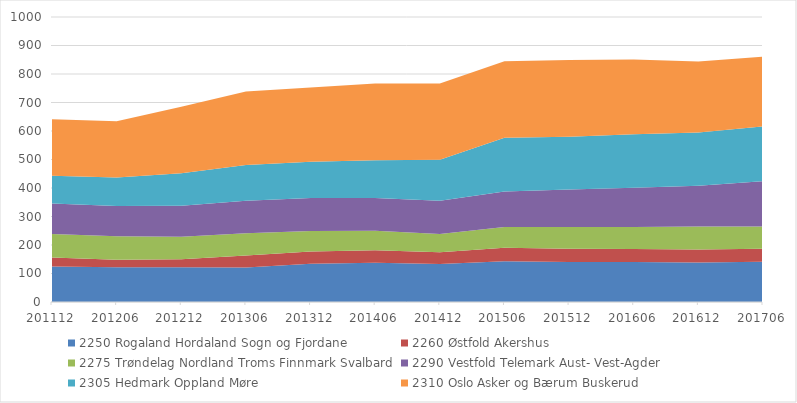
| Category | 2250 Rogaland Hordaland Sogn og Fjordane | 2260 Østfold Akershus | 2275 Trøndelag Nordland Troms Finnmark Svalbard | 2290 Vestfold Telemark Aust- Vest-Agder | 2305 Hedmark Oppland Møre | 2310 Oslo Asker og Bærum Buskerud |
|---|---|---|---|---|---|---|
| 201112.0 | 125 | 31 | 83 | 107 | 97 | 198 |
| 201206.0 | 122 | 26 | 83 | 106 | 100 | 197 |
| 201212.0 | 122 | 28 | 79 | 109 | 114 | 233 |
| 201306.0 | 121 | 42 | 78 | 114 | 126 | 258 |
| 201312.0 | 134 | 43 | 72 | 116 | 127 | 261 |
| 201406.0 | 138 | 44 | 68 | 115 | 132 | 270 |
| 201412.0 | 133 | 42 | 64 | 116 | 144 | 268 |
| 201506.0 | 143 | 47 | 73 | 125 | 188 | 269 |
| 201512.0 | 140 | 47 | 76 | 132 | 185 | 269 |
| 201606.0 | 140 | 46 | 77 | 138 | 188 | 262 |
| 201612.0 | 139 | 45 | 81 | 143 | 187 | 249 |
| 201706.0 | 141 | 46 | 78 | 159 | 192 | 245 |